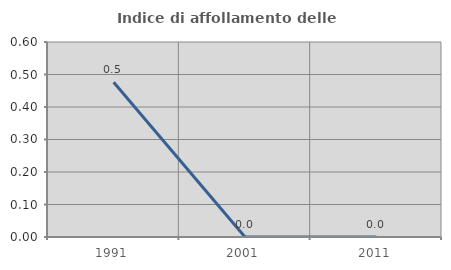
| Category | Indice di affollamento delle abitazioni  |
|---|---|
| 1991.0 | 0.476 |
| 2001.0 | 0 |
| 2011.0 | 0 |